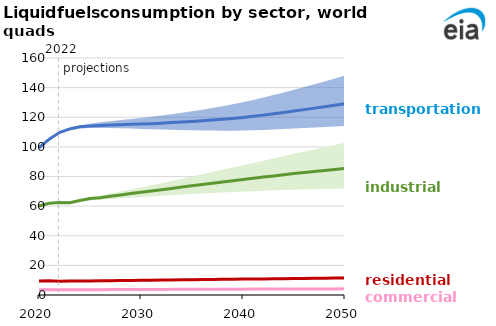
| Category | RES-Reference | COM-Reference | IND-Reference | TRANS-Reference |
|---|---|---|---|---|
| 2020.0 | 9.374 | 3.474 | 60.038 | 99.263 |
| 2021.0 | 9.654 | 3.626 | 61.975 | 105.216 |
| 2022.0 | 9.354 | 3.493 | 62.368 | 109.714 |
| 2023.0 | 9.425 | 3.538 | 62.323 | 112.172 |
| 2024.0 | 9.414 | 3.539 | 63.842 | 113.534 |
| 2025.0 | 9.515 | 3.593 | 65.175 | 114.108 |
| 2026.0 | 9.596 | 3.623 | 65.722 | 114.452 |
| 2027.0 | 9.677 | 3.648 | 66.645 | 114.738 |
| 2028.0 | 9.762 | 3.68 | 67.572 | 115.009 |
| 2029.0 | 9.845 | 3.706 | 68.448 | 115.269 |
| 2030.0 | 9.927 | 3.731 | 69.327 | 115.436 |
| 2031.0 | 10.01 | 3.754 | 70.185 | 115.665 |
| 2032.0 | 10.092 | 3.779 | 71.09 | 115.997 |
| 2033.0 | 10.174 | 3.802 | 71.955 | 116.396 |
| 2034.0 | 10.253 | 3.825 | 72.912 | 116.795 |
| 2035.0 | 10.334 | 3.847 | 73.812 | 117.199 |
| 2036.0 | 10.412 | 3.869 | 74.665 | 117.613 |
| 2037.0 | 10.491 | 3.891 | 75.514 | 118.085 |
| 2038.0 | 10.567 | 3.91 | 76.32 | 118.631 |
| 2039.0 | 10.644 | 3.93 | 77.13 | 119.204 |
| 2040.0 | 10.72 | 3.95 | 77.96 | 119.891 |
| 2041.0 | 10.798 | 3.971 | 78.794 | 120.611 |
| 2042.0 | 10.877 | 3.991 | 79.614 | 121.434 |
| 2043.0 | 10.957 | 4.012 | 80.408 | 122.309 |
| 2044.0 | 11.036 | 4.031 | 81.202 | 123.24 |
| 2045.0 | 11.117 | 4.052 | 81.976 | 124.183 |
| 2046.0 | 11.196 | 4.071 | 82.718 | 125.154 |
| 2047.0 | 11.274 | 4.09 | 83.449 | 126.156 |
| 2048.0 | 11.349 | 4.108 | 84.12 | 127.133 |
| 2049.0 | 11.426 | 4.127 | 84.789 | 128.109 |
| 2050.0 | 11.501 | 4.145 | 85.509 | 129.121 |